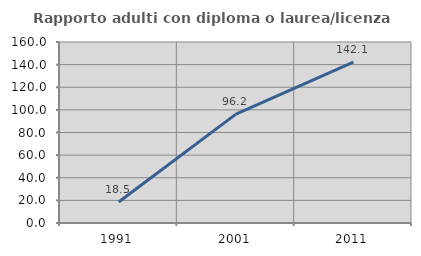
| Category | Rapporto adulti con diploma o laurea/licenza media  |
|---|---|
| 1991.0 | 18.519 |
| 2001.0 | 96.226 |
| 2011.0 | 142.105 |